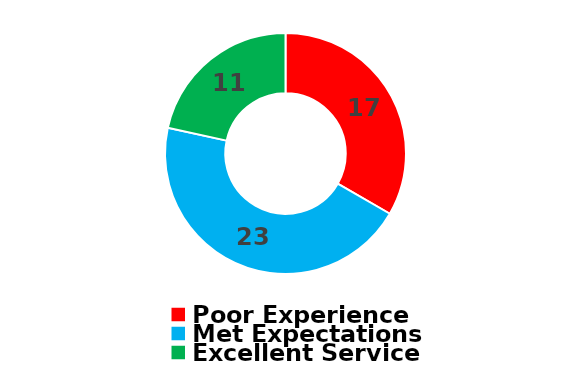
| Category | Series 0 |
|---|---|
| Poor Experience | 17 |
| Met Expectations | 23 |
| Excellent Service | 11 |